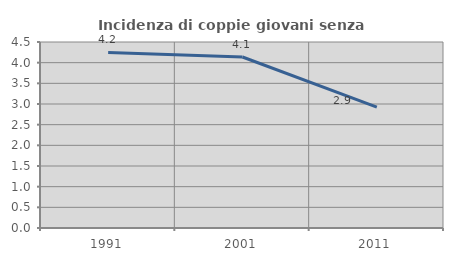
| Category | Incidenza di coppie giovani senza figli |
|---|---|
| 1991.0 | 4.248 |
| 2001.0 | 4.137 |
| 2011.0 | 2.923 |